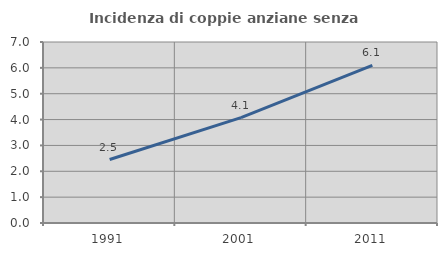
| Category | Incidenza di coppie anziane senza figli  |
|---|---|
| 1991.0 | 2.454 |
| 2001.0 | 4.075 |
| 2011.0 | 6.099 |